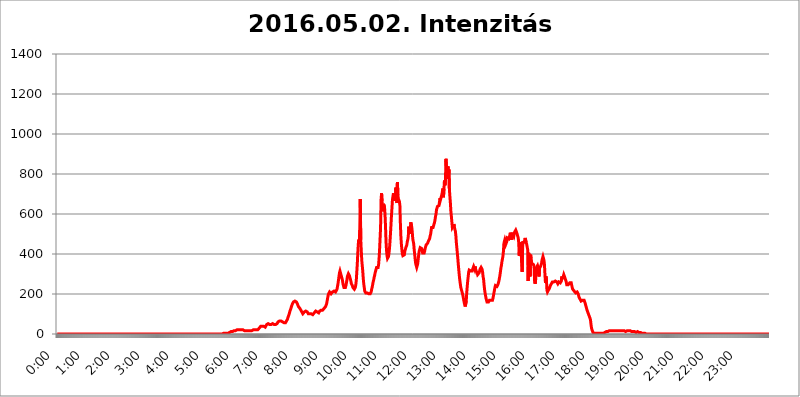
| Category | 2016.05.02. Intenzitás [W/m^2] |
|---|---|
| 0.0 | 0 |
| 0.0006944444444444445 | 0 |
| 0.001388888888888889 | 0 |
| 0.0020833333333333333 | 0 |
| 0.002777777777777778 | 0 |
| 0.003472222222222222 | 0 |
| 0.004166666666666667 | 0 |
| 0.004861111111111111 | 0 |
| 0.005555555555555556 | 0 |
| 0.0062499999999999995 | 0 |
| 0.006944444444444444 | 0 |
| 0.007638888888888889 | 0 |
| 0.008333333333333333 | 0 |
| 0.009027777777777779 | 0 |
| 0.009722222222222222 | 0 |
| 0.010416666666666666 | 0 |
| 0.011111111111111112 | 0 |
| 0.011805555555555555 | 0 |
| 0.012499999999999999 | 0 |
| 0.013194444444444444 | 0 |
| 0.013888888888888888 | 0 |
| 0.014583333333333332 | 0 |
| 0.015277777777777777 | 0 |
| 0.015972222222222224 | 0 |
| 0.016666666666666666 | 0 |
| 0.017361111111111112 | 0 |
| 0.018055555555555557 | 0 |
| 0.01875 | 0 |
| 0.019444444444444445 | 0 |
| 0.02013888888888889 | 0 |
| 0.020833333333333332 | 0 |
| 0.02152777777777778 | 0 |
| 0.022222222222222223 | 0 |
| 0.02291666666666667 | 0 |
| 0.02361111111111111 | 0 |
| 0.024305555555555556 | 0 |
| 0.024999999999999998 | 0 |
| 0.025694444444444447 | 0 |
| 0.02638888888888889 | 0 |
| 0.027083333333333334 | 0 |
| 0.027777777777777776 | 0 |
| 0.02847222222222222 | 0 |
| 0.029166666666666664 | 0 |
| 0.029861111111111113 | 0 |
| 0.030555555555555555 | 0 |
| 0.03125 | 0 |
| 0.03194444444444445 | 0 |
| 0.03263888888888889 | 0 |
| 0.03333333333333333 | 0 |
| 0.034027777777777775 | 0 |
| 0.034722222222222224 | 0 |
| 0.035416666666666666 | 0 |
| 0.036111111111111115 | 0 |
| 0.03680555555555556 | 0 |
| 0.0375 | 0 |
| 0.03819444444444444 | 0 |
| 0.03888888888888889 | 0 |
| 0.03958333333333333 | 0 |
| 0.04027777777777778 | 0 |
| 0.04097222222222222 | 0 |
| 0.041666666666666664 | 0 |
| 0.042361111111111106 | 0 |
| 0.04305555555555556 | 0 |
| 0.043750000000000004 | 0 |
| 0.044444444444444446 | 0 |
| 0.04513888888888889 | 0 |
| 0.04583333333333334 | 0 |
| 0.04652777777777778 | 0 |
| 0.04722222222222222 | 0 |
| 0.04791666666666666 | 0 |
| 0.04861111111111111 | 0 |
| 0.049305555555555554 | 0 |
| 0.049999999999999996 | 0 |
| 0.05069444444444445 | 0 |
| 0.051388888888888894 | 0 |
| 0.052083333333333336 | 0 |
| 0.05277777777777778 | 0 |
| 0.05347222222222222 | 0 |
| 0.05416666666666667 | 0 |
| 0.05486111111111111 | 0 |
| 0.05555555555555555 | 0 |
| 0.05625 | 0 |
| 0.05694444444444444 | 0 |
| 0.057638888888888885 | 0 |
| 0.05833333333333333 | 0 |
| 0.05902777777777778 | 0 |
| 0.059722222222222225 | 0 |
| 0.06041666666666667 | 0 |
| 0.061111111111111116 | 0 |
| 0.06180555555555556 | 0 |
| 0.0625 | 0 |
| 0.06319444444444444 | 0 |
| 0.06388888888888888 | 0 |
| 0.06458333333333334 | 0 |
| 0.06527777777777778 | 0 |
| 0.06597222222222222 | 0 |
| 0.06666666666666667 | 0 |
| 0.06736111111111111 | 0 |
| 0.06805555555555555 | 0 |
| 0.06874999999999999 | 0 |
| 0.06944444444444443 | 0 |
| 0.07013888888888889 | 0 |
| 0.07083333333333333 | 0 |
| 0.07152777777777779 | 0 |
| 0.07222222222222223 | 0 |
| 0.07291666666666667 | 0 |
| 0.07361111111111111 | 0 |
| 0.07430555555555556 | 0 |
| 0.075 | 0 |
| 0.07569444444444444 | 0 |
| 0.0763888888888889 | 0 |
| 0.07708333333333334 | 0 |
| 0.07777777777777778 | 0 |
| 0.07847222222222222 | 0 |
| 0.07916666666666666 | 0 |
| 0.0798611111111111 | 0 |
| 0.08055555555555556 | 0 |
| 0.08125 | 0 |
| 0.08194444444444444 | 0 |
| 0.08263888888888889 | 0 |
| 0.08333333333333333 | 0 |
| 0.08402777777777777 | 0 |
| 0.08472222222222221 | 0 |
| 0.08541666666666665 | 0 |
| 0.08611111111111112 | 0 |
| 0.08680555555555557 | 0 |
| 0.08750000000000001 | 0 |
| 0.08819444444444445 | 0 |
| 0.08888888888888889 | 0 |
| 0.08958333333333333 | 0 |
| 0.09027777777777778 | 0 |
| 0.09097222222222222 | 0 |
| 0.09166666666666667 | 0 |
| 0.09236111111111112 | 0 |
| 0.09305555555555556 | 0 |
| 0.09375 | 0 |
| 0.09444444444444444 | 0 |
| 0.09513888888888888 | 0 |
| 0.09583333333333333 | 0 |
| 0.09652777777777777 | 0 |
| 0.09722222222222222 | 0 |
| 0.09791666666666667 | 0 |
| 0.09861111111111111 | 0 |
| 0.09930555555555555 | 0 |
| 0.09999999999999999 | 0 |
| 0.10069444444444443 | 0 |
| 0.1013888888888889 | 0 |
| 0.10208333333333335 | 0 |
| 0.10277777777777779 | 0 |
| 0.10347222222222223 | 0 |
| 0.10416666666666667 | 0 |
| 0.10486111111111111 | 0 |
| 0.10555555555555556 | 0 |
| 0.10625 | 0 |
| 0.10694444444444444 | 0 |
| 0.1076388888888889 | 0 |
| 0.10833333333333334 | 0 |
| 0.10902777777777778 | 0 |
| 0.10972222222222222 | 0 |
| 0.1111111111111111 | 0 |
| 0.11180555555555556 | 0 |
| 0.11180555555555556 | 0 |
| 0.1125 | 0 |
| 0.11319444444444444 | 0 |
| 0.11388888888888889 | 0 |
| 0.11458333333333333 | 0 |
| 0.11527777777777777 | 0 |
| 0.11597222222222221 | 0 |
| 0.11666666666666665 | 0 |
| 0.1173611111111111 | 0 |
| 0.11805555555555557 | 0 |
| 0.11944444444444445 | 0 |
| 0.12013888888888889 | 0 |
| 0.12083333333333333 | 0 |
| 0.12152777777777778 | 0 |
| 0.12222222222222223 | 0 |
| 0.12291666666666667 | 0 |
| 0.12291666666666667 | 0 |
| 0.12361111111111112 | 0 |
| 0.12430555555555556 | 0 |
| 0.125 | 0 |
| 0.12569444444444444 | 0 |
| 0.12638888888888888 | 0 |
| 0.12708333333333333 | 0 |
| 0.16875 | 0 |
| 0.12847222222222224 | 0 |
| 0.12916666666666668 | 0 |
| 0.12986111111111112 | 0 |
| 0.13055555555555556 | 0 |
| 0.13125 | 0 |
| 0.13194444444444445 | 0 |
| 0.1326388888888889 | 0 |
| 0.13333333333333333 | 0 |
| 0.13402777777777777 | 0 |
| 0.13402777777777777 | 0 |
| 0.13472222222222222 | 0 |
| 0.13541666666666666 | 0 |
| 0.1361111111111111 | 0 |
| 0.13749999999999998 | 0 |
| 0.13819444444444443 | 0 |
| 0.1388888888888889 | 0 |
| 0.13958333333333334 | 0 |
| 0.14027777777777778 | 0 |
| 0.14097222222222222 | 0 |
| 0.14166666666666666 | 0 |
| 0.1423611111111111 | 0 |
| 0.14305555555555557 | 0 |
| 0.14375000000000002 | 0 |
| 0.14444444444444446 | 0 |
| 0.1451388888888889 | 0 |
| 0.1451388888888889 | 0 |
| 0.14652777777777778 | 0 |
| 0.14722222222222223 | 0 |
| 0.14791666666666667 | 0 |
| 0.1486111111111111 | 0 |
| 0.14930555555555555 | 0 |
| 0.15 | 0 |
| 0.15069444444444444 | 0 |
| 0.15138888888888888 | 0 |
| 0.15208333333333332 | 0 |
| 0.15277777777777776 | 0 |
| 0.15347222222222223 | 0 |
| 0.15416666666666667 | 0 |
| 0.15486111111111112 | 0 |
| 0.15555555555555556 | 0 |
| 0.15625 | 0 |
| 0.15694444444444444 | 0 |
| 0.15763888888888888 | 0 |
| 0.15833333333333333 | 0 |
| 0.15902777777777777 | 0 |
| 0.15972222222222224 | 0 |
| 0.16041666666666668 | 0 |
| 0.16111111111111112 | 0 |
| 0.16180555555555556 | 0 |
| 0.1625 | 0 |
| 0.16319444444444445 | 0 |
| 0.1638888888888889 | 0 |
| 0.16458333333333333 | 0 |
| 0.16527777777777777 | 0 |
| 0.16597222222222222 | 0 |
| 0.16666666666666666 | 0 |
| 0.1673611111111111 | 0 |
| 0.16805555555555554 | 0 |
| 0.16874999999999998 | 0 |
| 0.16944444444444443 | 0 |
| 0.17013888888888887 | 0 |
| 0.1708333333333333 | 0 |
| 0.17152777777777775 | 0 |
| 0.17222222222222225 | 0 |
| 0.1729166666666667 | 0 |
| 0.17361111111111113 | 0 |
| 0.17430555555555557 | 0 |
| 0.17500000000000002 | 0 |
| 0.17569444444444446 | 0 |
| 0.1763888888888889 | 0 |
| 0.17708333333333334 | 0 |
| 0.17777777777777778 | 0 |
| 0.17847222222222223 | 0 |
| 0.17916666666666667 | 0 |
| 0.1798611111111111 | 0 |
| 0.18055555555555555 | 0 |
| 0.18125 | 0 |
| 0.18194444444444444 | 0 |
| 0.1826388888888889 | 0 |
| 0.18333333333333335 | 0 |
| 0.1840277777777778 | 0 |
| 0.18472222222222223 | 0 |
| 0.18541666666666667 | 0 |
| 0.18611111111111112 | 0 |
| 0.18680555555555556 | 0 |
| 0.1875 | 0 |
| 0.18819444444444444 | 0 |
| 0.18888888888888888 | 0 |
| 0.18958333333333333 | 0 |
| 0.19027777777777777 | 0 |
| 0.1909722222222222 | 0 |
| 0.19166666666666665 | 0 |
| 0.19236111111111112 | 0 |
| 0.19305555555555554 | 0 |
| 0.19375 | 0 |
| 0.19444444444444445 | 0 |
| 0.1951388888888889 | 0 |
| 0.19583333333333333 | 0 |
| 0.19652777777777777 | 0 |
| 0.19722222222222222 | 0 |
| 0.19791666666666666 | 0 |
| 0.1986111111111111 | 0 |
| 0.19930555555555554 | 0 |
| 0.19999999999999998 | 0 |
| 0.20069444444444443 | 0 |
| 0.20138888888888887 | 0 |
| 0.2020833333333333 | 0 |
| 0.2027777777777778 | 0 |
| 0.2034722222222222 | 0 |
| 0.2041666666666667 | 0 |
| 0.20486111111111113 | 0 |
| 0.20555555555555557 | 0 |
| 0.20625000000000002 | 0 |
| 0.20694444444444446 | 0 |
| 0.2076388888888889 | 0 |
| 0.20833333333333334 | 0 |
| 0.20902777777777778 | 0 |
| 0.20972222222222223 | 0 |
| 0.21041666666666667 | 0 |
| 0.2111111111111111 | 0 |
| 0.21180555555555555 | 0 |
| 0.2125 | 0 |
| 0.21319444444444444 | 0 |
| 0.2138888888888889 | 0 |
| 0.21458333333333335 | 0 |
| 0.2152777777777778 | 0 |
| 0.21597222222222223 | 0 |
| 0.21666666666666667 | 0 |
| 0.21736111111111112 | 0 |
| 0.21805555555555556 | 0 |
| 0.21875 | 0 |
| 0.21944444444444444 | 0 |
| 0.22013888888888888 | 0 |
| 0.22083333333333333 | 0 |
| 0.22152777777777777 | 0 |
| 0.2222222222222222 | 0 |
| 0.22291666666666665 | 0 |
| 0.2236111111111111 | 0 |
| 0.22430555555555556 | 0 |
| 0.225 | 0 |
| 0.22569444444444445 | 0 |
| 0.2263888888888889 | 0 |
| 0.22708333333333333 | 0 |
| 0.22777777777777777 | 0 |
| 0.22847222222222222 | 0 |
| 0.22916666666666666 | 0 |
| 0.2298611111111111 | 0 |
| 0.23055555555555554 | 0 |
| 0.23124999999999998 | 0 |
| 0.23194444444444443 | 3.525 |
| 0.23263888888888887 | 3.525 |
| 0.2333333333333333 | 3.525 |
| 0.2340277777777778 | 3.525 |
| 0.2347222222222222 | 3.525 |
| 0.2354166666666667 | 3.525 |
| 0.23611111111111113 | 3.525 |
| 0.23680555555555557 | 3.525 |
| 0.23750000000000002 | 3.525 |
| 0.23819444444444446 | 3.525 |
| 0.2388888888888889 | 3.525 |
| 0.23958333333333334 | 3.525 |
| 0.24027777777777778 | 7.887 |
| 0.24097222222222223 | 7.887 |
| 0.24166666666666667 | 7.887 |
| 0.2423611111111111 | 7.887 |
| 0.24305555555555555 | 7.887 |
| 0.24375 | 12.257 |
| 0.24444444444444446 | 7.887 |
| 0.24513888888888888 | 12.257 |
| 0.24583333333333335 | 12.257 |
| 0.2465277777777778 | 12.257 |
| 0.24722222222222223 | 12.257 |
| 0.24791666666666667 | 16.636 |
| 0.24861111111111112 | 16.636 |
| 0.24930555555555556 | 16.636 |
| 0.25 | 16.636 |
| 0.25069444444444444 | 16.636 |
| 0.2513888888888889 | 21.024 |
| 0.2520833333333333 | 21.024 |
| 0.25277777777777777 | 21.024 |
| 0.2534722222222222 | 21.024 |
| 0.25416666666666665 | 21.024 |
| 0.2548611111111111 | 21.024 |
| 0.2555555555555556 | 21.024 |
| 0.25625000000000003 | 21.024 |
| 0.2569444444444445 | 21.024 |
| 0.2576388888888889 | 21.024 |
| 0.25833333333333336 | 21.024 |
| 0.2590277777777778 | 21.024 |
| 0.25972222222222224 | 21.024 |
| 0.2604166666666667 | 21.024 |
| 0.2611111111111111 | 21.024 |
| 0.26180555555555557 | 21.024 |
| 0.2625 | 16.636 |
| 0.26319444444444445 | 16.636 |
| 0.2638888888888889 | 16.636 |
| 0.26458333333333334 | 16.636 |
| 0.2652777777777778 | 16.636 |
| 0.2659722222222222 | 16.636 |
| 0.26666666666666666 | 16.636 |
| 0.2673611111111111 | 16.636 |
| 0.26805555555555555 | 16.636 |
| 0.26875 | 16.636 |
| 0.26944444444444443 | 16.636 |
| 0.2701388888888889 | 16.636 |
| 0.2708333333333333 | 16.636 |
| 0.27152777777777776 | 16.636 |
| 0.2722222222222222 | 16.636 |
| 0.27291666666666664 | 16.636 |
| 0.2736111111111111 | 16.636 |
| 0.2743055555555555 | 16.636 |
| 0.27499999999999997 | 21.024 |
| 0.27569444444444446 | 21.024 |
| 0.27638888888888885 | 21.024 |
| 0.27708333333333335 | 21.024 |
| 0.2777777777777778 | 21.024 |
| 0.27847222222222223 | 21.024 |
| 0.2791666666666667 | 21.024 |
| 0.2798611111111111 | 21.024 |
| 0.28055555555555556 | 21.024 |
| 0.28125 | 21.024 |
| 0.28194444444444444 | 25.419 |
| 0.2826388888888889 | 25.419 |
| 0.2833333333333333 | 29.823 |
| 0.28402777777777777 | 29.823 |
| 0.2847222222222222 | 34.234 |
| 0.28541666666666665 | 38.653 |
| 0.28611111111111115 | 38.653 |
| 0.28680555555555554 | 38.653 |
| 0.28750000000000003 | 38.653 |
| 0.2881944444444445 | 38.653 |
| 0.2888888888888889 | 38.653 |
| 0.28958333333333336 | 38.653 |
| 0.2902777777777778 | 34.234 |
| 0.29097222222222224 | 34.234 |
| 0.2916666666666667 | 34.234 |
| 0.2923611111111111 | 38.653 |
| 0.29305555555555557 | 38.653 |
| 0.29375 | 47.511 |
| 0.29444444444444445 | 47.511 |
| 0.2951388888888889 | 51.951 |
| 0.29583333333333334 | 51.951 |
| 0.2965277777777778 | 47.511 |
| 0.2972222222222222 | 47.511 |
| 0.29791666666666666 | 47.511 |
| 0.2986111111111111 | 47.511 |
| 0.29930555555555555 | 47.511 |
| 0.3 | 47.511 |
| 0.30069444444444443 | 51.951 |
| 0.3013888888888889 | 51.951 |
| 0.3020833333333333 | 51.951 |
| 0.30277777777777776 | 51.951 |
| 0.3034722222222222 | 47.511 |
| 0.30416666666666664 | 47.511 |
| 0.3048611111111111 | 47.511 |
| 0.3055555555555555 | 47.511 |
| 0.30624999999999997 | 47.511 |
| 0.3069444444444444 | 47.511 |
| 0.3076388888888889 | 47.511 |
| 0.30833333333333335 | 51.951 |
| 0.3090277777777778 | 56.398 |
| 0.30972222222222223 | 60.85 |
| 0.3104166666666667 | 60.85 |
| 0.3111111111111111 | 65.31 |
| 0.31180555555555556 | 65.31 |
| 0.3125 | 65.31 |
| 0.31319444444444444 | 65.31 |
| 0.3138888888888889 | 65.31 |
| 0.3145833333333333 | 65.31 |
| 0.31527777777777777 | 65.31 |
| 0.3159722222222222 | 60.85 |
| 0.31666666666666665 | 60.85 |
| 0.31736111111111115 | 60.85 |
| 0.31805555555555554 | 56.398 |
| 0.31875000000000003 | 56.398 |
| 0.3194444444444445 | 56.398 |
| 0.3201388888888889 | 56.398 |
| 0.32083333333333336 | 60.85 |
| 0.3215277777777778 | 65.31 |
| 0.32222222222222224 | 69.775 |
| 0.3229166666666667 | 74.246 |
| 0.3236111111111111 | 83.205 |
| 0.32430555555555557 | 87.692 |
| 0.325 | 96.682 |
| 0.32569444444444445 | 105.69 |
| 0.3263888888888889 | 114.716 |
| 0.32708333333333334 | 119.235 |
| 0.3277777777777778 | 128.284 |
| 0.3284722222222222 | 137.347 |
| 0.32916666666666666 | 141.884 |
| 0.3298611111111111 | 150.964 |
| 0.33055555555555555 | 155.509 |
| 0.33125 | 160.056 |
| 0.33194444444444443 | 164.605 |
| 0.3326388888888889 | 164.605 |
| 0.3333333333333333 | 164.605 |
| 0.3340277777777778 | 169.156 |
| 0.3347222222222222 | 164.605 |
| 0.3354166666666667 | 160.056 |
| 0.3361111111111111 | 155.509 |
| 0.3368055555555556 | 150.964 |
| 0.33749999999999997 | 146.423 |
| 0.33819444444444446 | 137.347 |
| 0.33888888888888885 | 137.347 |
| 0.33958333333333335 | 132.814 |
| 0.34027777777777773 | 128.284 |
| 0.34097222222222223 | 123.758 |
| 0.3416666666666666 | 119.235 |
| 0.3423611111111111 | 114.716 |
| 0.3430555555555555 | 110.201 |
| 0.34375 | 105.69 |
| 0.3444444444444445 | 101.184 |
| 0.3451388888888889 | 105.69 |
| 0.3458333333333334 | 105.69 |
| 0.34652777777777777 | 110.201 |
| 0.34722222222222227 | 110.201 |
| 0.34791666666666665 | 114.716 |
| 0.34861111111111115 | 114.716 |
| 0.34930555555555554 | 119.235 |
| 0.35000000000000003 | 114.716 |
| 0.3506944444444444 | 110.201 |
| 0.3513888888888889 | 105.69 |
| 0.3520833333333333 | 101.184 |
| 0.3527777777777778 | 101.184 |
| 0.3534722222222222 | 101.184 |
| 0.3541666666666667 | 101.184 |
| 0.3548611111111111 | 101.184 |
| 0.35555555555555557 | 101.184 |
| 0.35625 | 101.184 |
| 0.35694444444444445 | 101.184 |
| 0.3576388888888889 | 96.682 |
| 0.35833333333333334 | 96.682 |
| 0.3590277777777778 | 101.184 |
| 0.3597222222222222 | 101.184 |
| 0.36041666666666666 | 105.69 |
| 0.3611111111111111 | 110.201 |
| 0.36180555555555555 | 110.201 |
| 0.3625 | 114.716 |
| 0.36319444444444443 | 114.716 |
| 0.3638888888888889 | 110.201 |
| 0.3645833333333333 | 110.201 |
| 0.3652777777777778 | 105.69 |
| 0.3659722222222222 | 105.69 |
| 0.3666666666666667 | 105.69 |
| 0.3673611111111111 | 110.201 |
| 0.3680555555555556 | 114.716 |
| 0.36874999999999997 | 114.716 |
| 0.36944444444444446 | 119.235 |
| 0.37013888888888885 | 119.235 |
| 0.37083333333333335 | 119.235 |
| 0.37152777777777773 | 119.235 |
| 0.37222222222222223 | 119.235 |
| 0.3729166666666666 | 123.758 |
| 0.3736111111111111 | 123.758 |
| 0.3743055555555555 | 128.284 |
| 0.375 | 128.284 |
| 0.3756944444444445 | 132.814 |
| 0.3763888888888889 | 137.347 |
| 0.3770833333333334 | 141.884 |
| 0.37777777777777777 | 150.964 |
| 0.37847222222222227 | 164.605 |
| 0.37916666666666665 | 178.264 |
| 0.37986111111111115 | 191.937 |
| 0.38055555555555554 | 201.058 |
| 0.38125000000000003 | 205.62 |
| 0.3819444444444444 | 210.182 |
| 0.3826388888888889 | 210.182 |
| 0.3833333333333333 | 205.62 |
| 0.3840277777777778 | 201.058 |
| 0.3847222222222222 | 205.62 |
| 0.3854166666666667 | 205.62 |
| 0.3861111111111111 | 210.182 |
| 0.38680555555555557 | 210.182 |
| 0.3875 | 214.746 |
| 0.38819444444444445 | 214.746 |
| 0.3888888888888889 | 210.182 |
| 0.38958333333333334 | 210.182 |
| 0.3902777777777778 | 210.182 |
| 0.3909722222222222 | 210.182 |
| 0.39166666666666666 | 214.746 |
| 0.3923611111111111 | 223.873 |
| 0.39305555555555555 | 237.564 |
| 0.39375 | 251.251 |
| 0.39444444444444443 | 269.49 |
| 0.3951388888888889 | 287.709 |
| 0.3958333333333333 | 305.898 |
| 0.3965277777777778 | 314.98 |
| 0.3972222222222222 | 310.44 |
| 0.3979166666666667 | 296.808 |
| 0.3986111111111111 | 287.709 |
| 0.3993055555555556 | 278.603 |
| 0.39999999999999997 | 269.49 |
| 0.40069444444444446 | 251.251 |
| 0.40138888888888885 | 242.127 |
| 0.40208333333333335 | 233 |
| 0.40277777777777773 | 228.436 |
| 0.40347222222222223 | 228.436 |
| 0.4041666666666666 | 233 |
| 0.4048611111111111 | 242.127 |
| 0.4055555555555555 | 255.813 |
| 0.40625 | 269.49 |
| 0.4069444444444445 | 287.709 |
| 0.4076388888888889 | 292.259 |
| 0.4083333333333334 | 301.354 |
| 0.40902777777777777 | 301.354 |
| 0.40972222222222227 | 292.259 |
| 0.41041666666666665 | 283.156 |
| 0.41111111111111115 | 274.047 |
| 0.41180555555555554 | 264.932 |
| 0.41250000000000003 | 251.251 |
| 0.4131944444444444 | 246.689 |
| 0.4138888888888889 | 242.127 |
| 0.4145833333333333 | 233 |
| 0.4152777777777778 | 233 |
| 0.4159722222222222 | 228.436 |
| 0.4166666666666667 | 223.873 |
| 0.4173611111111111 | 228.436 |
| 0.41805555555555557 | 233 |
| 0.41875 | 246.689 |
| 0.41944444444444445 | 269.49 |
| 0.4201388888888889 | 310.44 |
| 0.42083333333333334 | 351.198 |
| 0.4215277777777778 | 405.108 |
| 0.4222222222222222 | 449.551 |
| 0.42291666666666666 | 471.582 |
| 0.4236111111111111 | 449.551 |
| 0.42430555555555555 | 519.555 |
| 0.425 | 675.311 |
| 0.42569444444444443 | 471.582 |
| 0.4263888888888889 | 418.492 |
| 0.4270833333333333 | 369.23 |
| 0.4277777777777778 | 342.162 |
| 0.4284722222222222 | 314.98 |
| 0.4291666666666667 | 278.603 |
| 0.4298611111111111 | 251.251 |
| 0.4305555555555556 | 233 |
| 0.43124999999999997 | 214.746 |
| 0.43194444444444446 | 210.182 |
| 0.43263888888888885 | 205.62 |
| 0.43333333333333335 | 205.62 |
| 0.43402777777777773 | 205.62 |
| 0.43472222222222223 | 205.62 |
| 0.4354166666666666 | 201.058 |
| 0.4361111111111111 | 201.058 |
| 0.4368055555555555 | 201.058 |
| 0.4375 | 205.62 |
| 0.4381944444444445 | 205.62 |
| 0.4388888888888889 | 201.058 |
| 0.4395833333333334 | 205.62 |
| 0.44027777777777777 | 210.182 |
| 0.44097222222222227 | 223.873 |
| 0.44166666666666665 | 233 |
| 0.44236111111111115 | 246.689 |
| 0.44305555555555554 | 260.373 |
| 0.44375000000000003 | 269.49 |
| 0.4444444444444444 | 283.156 |
| 0.4451388888888889 | 292.259 |
| 0.4458333333333333 | 305.898 |
| 0.4465277777777778 | 314.98 |
| 0.4472222222222222 | 324.052 |
| 0.4479166666666667 | 333.113 |
| 0.4486111111111111 | 333.113 |
| 0.44930555555555557 | 328.584 |
| 0.45 | 333.113 |
| 0.45069444444444445 | 346.682 |
| 0.4513888888888889 | 378.224 |
| 0.45208333333333334 | 422.943 |
| 0.4527777777777778 | 475.972 |
| 0.4534722222222222 | 532.513 |
| 0.45416666666666666 | 671.22 |
| 0.4548611111111111 | 703.762 |
| 0.45555555555555555 | 663.019 |
| 0.45625 | 629.948 |
| 0.45694444444444443 | 613.252 |
| 0.4576388888888889 | 650.667 |
| 0.4583333333333333 | 654.791 |
| 0.4590277777777778 | 634.105 |
| 0.4597222222222222 | 596.45 |
| 0.4604166666666667 | 536.82 |
| 0.4611111111111111 | 462.786 |
| 0.4618055555555556 | 418.492 |
| 0.46249999999999997 | 391.685 |
| 0.46319444444444446 | 378.224 |
| 0.46388888888888885 | 378.224 |
| 0.46458333333333335 | 387.202 |
| 0.46527777777777773 | 405.108 |
| 0.46597222222222223 | 427.39 |
| 0.4666666666666666 | 462.786 |
| 0.4673611111111111 | 502.192 |
| 0.4680555555555555 | 545.416 |
| 0.46875 | 592.233 |
| 0.4694444444444445 | 629.948 |
| 0.4701388888888889 | 671.22 |
| 0.4708333333333334 | 687.544 |
| 0.47152777777777777 | 703.762 |
| 0.47222222222222227 | 667.123 |
| 0.47291666666666665 | 687.544 |
| 0.47361111111111115 | 691.608 |
| 0.47430555555555554 | 667.123 |
| 0.47500000000000003 | 731.896 |
| 0.4756944444444444 | 683.473 |
| 0.4763888888888889 | 654.791 |
| 0.4770833333333333 | 759.723 |
| 0.4777777777777778 | 695.666 |
| 0.4784722222222222 | 675.311 |
| 0.4791666666666667 | 675.311 |
| 0.4798611111111111 | 663.019 |
| 0.48055555555555557 | 642.4 |
| 0.48125 | 553.986 |
| 0.48194444444444445 | 489.108 |
| 0.4826388888888889 | 449.551 |
| 0.48333333333333334 | 422.943 |
| 0.4840277777777778 | 400.638 |
| 0.4847222222222222 | 391.685 |
| 0.48541666666666666 | 387.202 |
| 0.4861111111111111 | 391.685 |
| 0.48680555555555555 | 396.164 |
| 0.4875 | 414.035 |
| 0.48819444444444443 | 422.943 |
| 0.4888888888888889 | 431.833 |
| 0.4895833333333333 | 431.833 |
| 0.4902777777777778 | 445.129 |
| 0.4909722222222222 | 462.786 |
| 0.4916666666666667 | 471.582 |
| 0.4923611111111111 | 489.108 |
| 0.4930555555555556 | 536.82 |
| 0.49374999999999997 | 515.223 |
| 0.49444444444444446 | 502.192 |
| 0.49513888888888885 | 515.223 |
| 0.49583333333333335 | 558.261 |
| 0.49652777777777773 | 558.261 |
| 0.49722222222222223 | 532.513 |
| 0.4979166666666666 | 510.885 |
| 0.4986111111111111 | 475.972 |
| 0.4993055555555555 | 471.582 |
| 0.5 | 449.551 |
| 0.5006944444444444 | 418.492 |
| 0.5013888888888889 | 396.164 |
| 0.5020833333333333 | 369.23 |
| 0.5027777777777778 | 351.198 |
| 0.5034722222222222 | 342.162 |
| 0.5041666666666667 | 333.113 |
| 0.5048611111111111 | 337.639 |
| 0.5055555555555555 | 351.198 |
| 0.50625 | 373.729 |
| 0.5069444444444444 | 396.164 |
| 0.5076388888888889 | 414.035 |
| 0.5083333333333333 | 422.943 |
| 0.5090277777777777 | 431.833 |
| 0.5097222222222222 | 436.27 |
| 0.5104166666666666 | 436.27 |
| 0.5111111111111112 | 427.39 |
| 0.5118055555555555 | 418.492 |
| 0.5125000000000001 | 405.108 |
| 0.5131944444444444 | 400.638 |
| 0.513888888888889 | 400.638 |
| 0.5145833333333333 | 405.108 |
| 0.5152777777777778 | 414.035 |
| 0.5159722222222222 | 427.39 |
| 0.5166666666666667 | 436.27 |
| 0.517361111111111 | 445.129 |
| 0.5180555555555556 | 449.551 |
| 0.5187499999999999 | 449.551 |
| 0.5194444444444445 | 453.968 |
| 0.5201388888888888 | 458.38 |
| 0.5208333333333334 | 467.187 |
| 0.5215277777777778 | 471.582 |
| 0.5222222222222223 | 475.972 |
| 0.5229166666666667 | 489.108 |
| 0.5236111111111111 | 497.836 |
| 0.5243055555555556 | 515.223 |
| 0.525 | 532.513 |
| 0.5256944444444445 | 528.2 |
| 0.5263888888888889 | 528.2 |
| 0.5270833333333333 | 532.513 |
| 0.5277777777777778 | 541.121 |
| 0.5284722222222222 | 549.704 |
| 0.5291666666666667 | 558.261 |
| 0.5298611111111111 | 571.049 |
| 0.5305555555555556 | 588.009 |
| 0.53125 | 600.661 |
| 0.5319444444444444 | 621.613 |
| 0.5326388888888889 | 629.948 |
| 0.5333333333333333 | 638.256 |
| 0.5340277777777778 | 642.4 |
| 0.5347222222222222 | 642.4 |
| 0.5354166666666667 | 642.4 |
| 0.5361111111111111 | 646.537 |
| 0.5368055555555555 | 679.395 |
| 0.5375 | 671.22 |
| 0.5381944444444444 | 671.22 |
| 0.5388888888888889 | 671.22 |
| 0.5395833333333333 | 699.717 |
| 0.5402777777777777 | 695.666 |
| 0.5409722222222222 | 727.896 |
| 0.5416666666666666 | 683.473 |
| 0.5423611111111112 | 723.889 |
| 0.5430555555555555 | 767.62 |
| 0.5437500000000001 | 743.859 |
| 0.5444444444444444 | 763.674 |
| 0.545138888888889 | 875.918 |
| 0.5458333333333333 | 837.682 |
| 0.5465277777777778 | 798.974 |
| 0.5472222222222222 | 775.492 |
| 0.5479166666666667 | 837.682 |
| 0.548611111111111 | 787.258 |
| 0.5493055555555556 | 822.26 |
| 0.5499999999999999 | 723.889 |
| 0.5506944444444445 | 687.544 |
| 0.5513888888888888 | 654.791 |
| 0.5520833333333334 | 613.252 |
| 0.5527777777777778 | 588.009 |
| 0.5534722222222223 | 583.779 |
| 0.5541666666666667 | 532.513 |
| 0.5548611111111111 | 528.2 |
| 0.5555555555555556 | 541.121 |
| 0.55625 | 549.704 |
| 0.5569444444444445 | 536.82 |
| 0.5576388888888889 | 523.88 |
| 0.5583333333333333 | 515.223 |
| 0.5590277777777778 | 493.475 |
| 0.5597222222222222 | 458.38 |
| 0.5604166666666667 | 431.833 |
| 0.5611111111111111 | 405.108 |
| 0.5618055555555556 | 378.224 |
| 0.5625 | 346.682 |
| 0.5631944444444444 | 319.517 |
| 0.5638888888888889 | 292.259 |
| 0.5645833333333333 | 269.49 |
| 0.5652777777777778 | 251.251 |
| 0.5659722222222222 | 233 |
| 0.5666666666666667 | 223.873 |
| 0.5673611111111111 | 214.746 |
| 0.5680555555555555 | 205.62 |
| 0.56875 | 196.497 |
| 0.5694444444444444 | 182.82 |
| 0.5701388888888889 | 169.156 |
| 0.5708333333333333 | 155.509 |
| 0.5715277777777777 | 146.423 |
| 0.5722222222222222 | 137.347 |
| 0.5729166666666666 | 141.884 |
| 0.5736111111111112 | 164.605 |
| 0.5743055555555555 | 205.62 |
| 0.5750000000000001 | 237.564 |
| 0.5756944444444444 | 264.932 |
| 0.576388888888889 | 287.709 |
| 0.5770833333333333 | 310.44 |
| 0.5777777777777778 | 319.517 |
| 0.5784722222222222 | 319.517 |
| 0.5791666666666667 | 324.052 |
| 0.579861111111111 | 314.98 |
| 0.5805555555555556 | 310.44 |
| 0.5812499999999999 | 310.44 |
| 0.5819444444444445 | 314.98 |
| 0.5826388888888888 | 324.052 |
| 0.5833333333333334 | 328.584 |
| 0.5840277777777778 | 337.639 |
| 0.5847222222222223 | 333.113 |
| 0.5854166666666667 | 324.052 |
| 0.5861111111111111 | 337.639 |
| 0.5868055555555556 | 324.052 |
| 0.5875 | 314.98 |
| 0.5881944444444445 | 314.98 |
| 0.5888888888888889 | 305.898 |
| 0.5895833333333333 | 296.808 |
| 0.5902777777777778 | 292.259 |
| 0.5909722222222222 | 296.808 |
| 0.5916666666666667 | 305.898 |
| 0.5923611111111111 | 314.98 |
| 0.5930555555555556 | 324.052 |
| 0.59375 | 328.584 |
| 0.5944444444444444 | 333.113 |
| 0.5951388888888889 | 333.113 |
| 0.5958333333333333 | 324.052 |
| 0.5965277777777778 | 310.44 |
| 0.5972222222222222 | 287.709 |
| 0.5979166666666667 | 274.047 |
| 0.5986111111111111 | 246.689 |
| 0.5993055555555555 | 223.873 |
| 0.6 | 205.62 |
| 0.6006944444444444 | 191.937 |
| 0.6013888888888889 | 178.264 |
| 0.6020833333333333 | 169.156 |
| 0.6027777777777777 | 160.056 |
| 0.6034722222222222 | 155.509 |
| 0.6041666666666666 | 155.509 |
| 0.6048611111111112 | 160.056 |
| 0.6055555555555555 | 164.605 |
| 0.6062500000000001 | 169.156 |
| 0.6069444444444444 | 169.156 |
| 0.607638888888889 | 173.709 |
| 0.6083333333333333 | 169.156 |
| 0.6090277777777778 | 169.156 |
| 0.6097222222222222 | 164.605 |
| 0.6104166666666667 | 169.156 |
| 0.611111111111111 | 178.264 |
| 0.6118055555555556 | 191.937 |
| 0.6124999999999999 | 205.62 |
| 0.6131944444444445 | 219.309 |
| 0.6138888888888888 | 233 |
| 0.6145833333333334 | 242.127 |
| 0.6152777777777778 | 237.564 |
| 0.6159722222222223 | 237.564 |
| 0.6166666666666667 | 237.564 |
| 0.6173611111111111 | 237.564 |
| 0.6180555555555556 | 246.689 |
| 0.61875 | 251.251 |
| 0.6194444444444445 | 264.932 |
| 0.6201388888888889 | 278.603 |
| 0.6208333333333333 | 292.259 |
| 0.6215277777777778 | 310.44 |
| 0.6222222222222222 | 328.584 |
| 0.6229166666666667 | 342.162 |
| 0.6236111111111111 | 360.221 |
| 0.6243055555555556 | 373.729 |
| 0.625 | 387.202 |
| 0.6256944444444444 | 409.574 |
| 0.6263888888888889 | 449.551 |
| 0.6270833333333333 | 462.786 |
| 0.6277777777777778 | 471.582 |
| 0.6284722222222222 | 462.786 |
| 0.6291666666666667 | 449.551 |
| 0.6298611111111111 | 453.968 |
| 0.6305555555555555 | 462.786 |
| 0.63125 | 480.356 |
| 0.6319444444444444 | 480.356 |
| 0.6326388888888889 | 480.356 |
| 0.6333333333333333 | 475.972 |
| 0.6340277777777777 | 484.735 |
| 0.6347222222222222 | 493.475 |
| 0.6354166666666666 | 506.542 |
| 0.6361111111111112 | 506.542 |
| 0.6368055555555555 | 510.885 |
| 0.6375000000000001 | 471.582 |
| 0.6381944444444444 | 506.542 |
| 0.638888888888889 | 497.836 |
| 0.6395833333333333 | 502.192 |
| 0.6402777777777778 | 489.108 |
| 0.6409722222222222 | 506.542 |
| 0.6416666666666667 | 506.542 |
| 0.642361111111111 | 510.885 |
| 0.6430555555555556 | 519.555 |
| 0.6437499999999999 | 515.223 |
| 0.6444444444444445 | 506.542 |
| 0.6451388888888888 | 510.885 |
| 0.6458333333333334 | 502.192 |
| 0.6465277777777778 | 480.356 |
| 0.6472222222222223 | 458.38 |
| 0.6479166666666667 | 391.685 |
| 0.6486111111111111 | 436.27 |
| 0.6493055555555556 | 440.702 |
| 0.65 | 458.38 |
| 0.6506944444444445 | 462.786 |
| 0.6513888888888889 | 355.712 |
| 0.6520833333333333 | 310.44 |
| 0.6527777777777778 | 462.786 |
| 0.6534722222222222 | 453.968 |
| 0.6541666666666667 | 458.38 |
| 0.6548611111111111 | 453.968 |
| 0.6555555555555556 | 467.187 |
| 0.65625 | 480.356 |
| 0.6569444444444444 | 475.972 |
| 0.6576388888888889 | 458.38 |
| 0.6583333333333333 | 449.551 |
| 0.6590277777777778 | 453.968 |
| 0.6597222222222222 | 422.943 |
| 0.6604166666666667 | 264.932 |
| 0.6611111111111111 | 405.108 |
| 0.6618055555555555 | 405.108 |
| 0.6625 | 391.685 |
| 0.6631944444444444 | 287.709 |
| 0.6638888888888889 | 396.164 |
| 0.6645833333333333 | 378.224 |
| 0.6652777777777777 | 360.221 |
| 0.6659722222222222 | 351.198 |
| 0.6666666666666666 | 346.682 |
| 0.6673611111111111 | 346.682 |
| 0.6680555555555556 | 346.682 |
| 0.6687500000000001 | 337.639 |
| 0.6694444444444444 | 264.932 |
| 0.6701388888888888 | 251.251 |
| 0.6708333333333334 | 260.373 |
| 0.6715277777777778 | 324.052 |
| 0.6722222222222222 | 333.113 |
| 0.6729166666666666 | 337.639 |
| 0.6736111111111112 | 342.162 |
| 0.6743055555555556 | 333.113 |
| 0.6749999999999999 | 324.052 |
| 0.6756944444444444 | 287.709 |
| 0.6763888888888889 | 328.584 |
| 0.6770833333333334 | 333.113 |
| 0.6777777777777777 | 337.639 |
| 0.6784722222222223 | 337.639 |
| 0.6791666666666667 | 351.198 |
| 0.6798611111111111 | 369.23 |
| 0.6805555555555555 | 378.224 |
| 0.68125 | 387.202 |
| 0.6819444444444445 | 382.715 |
| 0.6826388888888889 | 369.23 |
| 0.6833333333333332 | 346.682 |
| 0.6840277777777778 | 296.808 |
| 0.6847222222222222 | 255.813 |
| 0.6854166666666667 | 287.709 |
| 0.686111111111111 | 269.49 |
| 0.6868055555555556 | 219.309 |
| 0.6875 | 210.182 |
| 0.6881944444444444 | 210.182 |
| 0.688888888888889 | 219.309 |
| 0.6895833333333333 | 223.873 |
| 0.6902777777777778 | 228.436 |
| 0.6909722222222222 | 233 |
| 0.6916666666666668 | 242.127 |
| 0.6923611111111111 | 246.689 |
| 0.6930555555555555 | 251.251 |
| 0.69375 | 255.813 |
| 0.6944444444444445 | 260.373 |
| 0.6951388888888889 | 255.813 |
| 0.6958333333333333 | 260.373 |
| 0.6965277777777777 | 260.373 |
| 0.6972222222222223 | 260.373 |
| 0.6979166666666666 | 264.932 |
| 0.6986111111111111 | 264.932 |
| 0.6993055555555556 | 264.932 |
| 0.7000000000000001 | 264.932 |
| 0.7006944444444444 | 260.373 |
| 0.7013888888888888 | 255.813 |
| 0.7020833333333334 | 251.251 |
| 0.7027777777777778 | 251.251 |
| 0.7034722222222222 | 260.373 |
| 0.7041666666666666 | 260.373 |
| 0.7048611111111112 | 260.373 |
| 0.7055555555555556 | 255.813 |
| 0.7062499999999999 | 260.373 |
| 0.7069444444444444 | 264.932 |
| 0.7076388888888889 | 287.709 |
| 0.7083333333333334 | 278.603 |
| 0.7090277777777777 | 278.603 |
| 0.7097222222222223 | 287.709 |
| 0.7104166666666667 | 296.808 |
| 0.7111111111111111 | 292.259 |
| 0.7118055555555555 | 283.156 |
| 0.7125 | 278.603 |
| 0.7131944444444445 | 278.603 |
| 0.7138888888888889 | 260.373 |
| 0.7145833333333332 | 246.689 |
| 0.7152777777777778 | 246.689 |
| 0.7159722222222222 | 246.689 |
| 0.7166666666666667 | 246.689 |
| 0.717361111111111 | 246.689 |
| 0.7180555555555556 | 251.251 |
| 0.71875 | 255.813 |
| 0.7194444444444444 | 260.373 |
| 0.720138888888889 | 260.373 |
| 0.7208333333333333 | 255.813 |
| 0.7215277777777778 | 251.251 |
| 0.7222222222222222 | 233 |
| 0.7229166666666668 | 223.873 |
| 0.7236111111111111 | 223.873 |
| 0.7243055555555555 | 219.309 |
| 0.725 | 214.746 |
| 0.7256944444444445 | 210.182 |
| 0.7263888888888889 | 210.182 |
| 0.7270833333333333 | 205.62 |
| 0.7277777777777777 | 205.62 |
| 0.7284722222222223 | 210.182 |
| 0.7291666666666666 | 210.182 |
| 0.7298611111111111 | 205.62 |
| 0.7305555555555556 | 201.058 |
| 0.7312500000000001 | 191.937 |
| 0.7319444444444444 | 182.82 |
| 0.7326388888888888 | 178.264 |
| 0.7333333333333334 | 173.709 |
| 0.7340277777777778 | 169.156 |
| 0.7347222222222222 | 164.605 |
| 0.7354166666666666 | 164.605 |
| 0.7361111111111112 | 164.605 |
| 0.7368055555555556 | 169.156 |
| 0.7374999999999999 | 173.709 |
| 0.7381944444444444 | 173.709 |
| 0.7388888888888889 | 169.156 |
| 0.7395833333333334 | 164.605 |
| 0.7402777777777777 | 155.509 |
| 0.7409722222222223 | 146.423 |
| 0.7416666666666667 | 137.347 |
| 0.7423611111111111 | 128.284 |
| 0.7430555555555555 | 119.235 |
| 0.74375 | 114.716 |
| 0.7444444444444445 | 105.69 |
| 0.7451388888888889 | 101.184 |
| 0.7458333333333332 | 92.184 |
| 0.7465277777777778 | 87.692 |
| 0.7472222222222222 | 78.722 |
| 0.7479166666666667 | 69.775 |
| 0.748611111111111 | 47.511 |
| 0.7493055555555556 | 29.823 |
| 0.75 | 21.024 |
| 0.7506944444444444 | 16.636 |
| 0.751388888888889 | 7.887 |
| 0.7520833333333333 | 3.525 |
| 0.7527777777777778 | 3.525 |
| 0.7534722222222222 | 3.525 |
| 0.7541666666666668 | 3.525 |
| 0.7548611111111111 | 3.525 |
| 0.7555555555555555 | 3.525 |
| 0.75625 | 3.525 |
| 0.7569444444444445 | 3.525 |
| 0.7576388888888889 | 3.525 |
| 0.7583333333333333 | 3.525 |
| 0.7590277777777777 | 3.525 |
| 0.7597222222222223 | 3.525 |
| 0.7604166666666666 | 3.525 |
| 0.7611111111111111 | 3.525 |
| 0.7618055555555556 | 3.525 |
| 0.7625000000000001 | 3.525 |
| 0.7631944444444444 | 3.525 |
| 0.7638888888888888 | 3.525 |
| 0.7645833333333334 | 3.525 |
| 0.7652777777777778 | 3.525 |
| 0.7659722222222222 | 3.525 |
| 0.7666666666666666 | 3.525 |
| 0.7673611111111112 | 7.887 |
| 0.7680555555555556 | 7.887 |
| 0.7687499999999999 | 7.887 |
| 0.7694444444444444 | 7.887 |
| 0.7701388888888889 | 12.257 |
| 0.7708333333333334 | 12.257 |
| 0.7715277777777777 | 12.257 |
| 0.7722222222222223 | 12.257 |
| 0.7729166666666667 | 16.636 |
| 0.7736111111111111 | 16.636 |
| 0.7743055555555555 | 16.636 |
| 0.775 | 16.636 |
| 0.7756944444444445 | 16.636 |
| 0.7763888888888889 | 16.636 |
| 0.7770833333333332 | 16.636 |
| 0.7777777777777778 | 16.636 |
| 0.7784722222222222 | 16.636 |
| 0.7791666666666667 | 16.636 |
| 0.779861111111111 | 16.636 |
| 0.7805555555555556 | 16.636 |
| 0.78125 | 16.636 |
| 0.7819444444444444 | 16.636 |
| 0.782638888888889 | 16.636 |
| 0.7833333333333333 | 16.636 |
| 0.7840277777777778 | 16.636 |
| 0.7847222222222222 | 16.636 |
| 0.7854166666666668 | 16.636 |
| 0.7861111111111111 | 16.636 |
| 0.7868055555555555 | 16.636 |
| 0.7875 | 16.636 |
| 0.7881944444444445 | 16.636 |
| 0.7888888888888889 | 16.636 |
| 0.7895833333333333 | 16.636 |
| 0.7902777777777777 | 16.636 |
| 0.7909722222222223 | 16.636 |
| 0.7916666666666666 | 16.636 |
| 0.7923611111111111 | 16.636 |
| 0.7930555555555556 | 16.636 |
| 0.7937500000000001 | 16.636 |
| 0.7944444444444444 | 16.636 |
| 0.7951388888888888 | 16.636 |
| 0.7958333333333334 | 16.636 |
| 0.7965277777777778 | 12.257 |
| 0.7972222222222222 | 12.257 |
| 0.7979166666666666 | 12.257 |
| 0.7986111111111112 | 16.636 |
| 0.7993055555555556 | 16.636 |
| 0.7999999999999999 | 16.636 |
| 0.8006944444444444 | 16.636 |
| 0.8013888888888889 | 16.636 |
| 0.8020833333333334 | 16.636 |
| 0.8027777777777777 | 16.636 |
| 0.8034722222222223 | 16.636 |
| 0.8041666666666667 | 12.257 |
| 0.8048611111111111 | 12.257 |
| 0.8055555555555555 | 12.257 |
| 0.80625 | 12.257 |
| 0.8069444444444445 | 12.257 |
| 0.8076388888888889 | 12.257 |
| 0.8083333333333332 | 12.257 |
| 0.8090277777777778 | 12.257 |
| 0.8097222222222222 | 12.257 |
| 0.8104166666666667 | 12.257 |
| 0.811111111111111 | 12.257 |
| 0.8118055555555556 | 7.887 |
| 0.8125 | 7.887 |
| 0.8131944444444444 | 7.887 |
| 0.813888888888889 | 12.257 |
| 0.8145833333333333 | 7.887 |
| 0.8152777777777778 | 7.887 |
| 0.8159722222222222 | 7.887 |
| 0.8166666666666668 | 7.887 |
| 0.8173611111111111 | 7.887 |
| 0.8180555555555555 | 7.887 |
| 0.81875 | 7.887 |
| 0.8194444444444445 | 3.525 |
| 0.8201388888888889 | 3.525 |
| 0.8208333333333333 | 3.525 |
| 0.8215277777777777 | 3.525 |
| 0.8222222222222223 | 3.525 |
| 0.8229166666666666 | 3.525 |
| 0.8236111111111111 | 3.525 |
| 0.8243055555555556 | 3.525 |
| 0.8250000000000001 | 3.525 |
| 0.8256944444444444 | 0 |
| 0.8263888888888888 | 0 |
| 0.8270833333333334 | 0 |
| 0.8277777777777778 | 0 |
| 0.8284722222222222 | 0 |
| 0.8291666666666666 | 0 |
| 0.8298611111111112 | 0 |
| 0.8305555555555556 | 0 |
| 0.8312499999999999 | 0 |
| 0.8319444444444444 | 0 |
| 0.8326388888888889 | 0 |
| 0.8333333333333334 | 0 |
| 0.8340277777777777 | 0 |
| 0.8347222222222223 | 0 |
| 0.8354166666666667 | 0 |
| 0.8361111111111111 | 0 |
| 0.8368055555555555 | 0 |
| 0.8375 | 0 |
| 0.8381944444444445 | 0 |
| 0.8388888888888889 | 0 |
| 0.8395833333333332 | 0 |
| 0.8402777777777778 | 0 |
| 0.8409722222222222 | 0 |
| 0.8416666666666667 | 0 |
| 0.842361111111111 | 0 |
| 0.8430555555555556 | 0 |
| 0.84375 | 0 |
| 0.8444444444444444 | 0 |
| 0.845138888888889 | 0 |
| 0.8458333333333333 | 0 |
| 0.8465277777777778 | 0 |
| 0.8472222222222222 | 0 |
| 0.8479166666666668 | 0 |
| 0.8486111111111111 | 0 |
| 0.8493055555555555 | 0 |
| 0.85 | 0 |
| 0.8506944444444445 | 0 |
| 0.8513888888888889 | 0 |
| 0.8520833333333333 | 0 |
| 0.8527777777777777 | 0 |
| 0.8534722222222223 | 0 |
| 0.8541666666666666 | 0 |
| 0.8548611111111111 | 0 |
| 0.8555555555555556 | 0 |
| 0.8562500000000001 | 0 |
| 0.8569444444444444 | 0 |
| 0.8576388888888888 | 0 |
| 0.8583333333333334 | 0 |
| 0.8590277777777778 | 0 |
| 0.8597222222222222 | 0 |
| 0.8604166666666666 | 0 |
| 0.8611111111111112 | 0 |
| 0.8618055555555556 | 0 |
| 0.8624999999999999 | 0 |
| 0.8631944444444444 | 0 |
| 0.8638888888888889 | 0 |
| 0.8645833333333334 | 0 |
| 0.8652777777777777 | 0 |
| 0.8659722222222223 | 0 |
| 0.8666666666666667 | 0 |
| 0.8673611111111111 | 0 |
| 0.8680555555555555 | 0 |
| 0.86875 | 0 |
| 0.8694444444444445 | 0 |
| 0.8701388888888889 | 0 |
| 0.8708333333333332 | 0 |
| 0.8715277777777778 | 0 |
| 0.8722222222222222 | 0 |
| 0.8729166666666667 | 0 |
| 0.873611111111111 | 0 |
| 0.8743055555555556 | 0 |
| 0.875 | 0 |
| 0.8756944444444444 | 0 |
| 0.876388888888889 | 0 |
| 0.8770833333333333 | 0 |
| 0.8777777777777778 | 0 |
| 0.8784722222222222 | 0 |
| 0.8791666666666668 | 0 |
| 0.8798611111111111 | 0 |
| 0.8805555555555555 | 0 |
| 0.88125 | 0 |
| 0.8819444444444445 | 0 |
| 0.8826388888888889 | 0 |
| 0.8833333333333333 | 0 |
| 0.8840277777777777 | 0 |
| 0.8847222222222223 | 0 |
| 0.8854166666666666 | 0 |
| 0.8861111111111111 | 0 |
| 0.8868055555555556 | 0 |
| 0.8875000000000001 | 0 |
| 0.8881944444444444 | 0 |
| 0.8888888888888888 | 0 |
| 0.8895833333333334 | 0 |
| 0.8902777777777778 | 0 |
| 0.8909722222222222 | 0 |
| 0.8916666666666666 | 0 |
| 0.8923611111111112 | 0 |
| 0.8930555555555556 | 0 |
| 0.8937499999999999 | 0 |
| 0.8944444444444444 | 0 |
| 0.8951388888888889 | 0 |
| 0.8958333333333334 | 0 |
| 0.8965277777777777 | 0 |
| 0.8972222222222223 | 0 |
| 0.8979166666666667 | 0 |
| 0.8986111111111111 | 0 |
| 0.8993055555555555 | 0 |
| 0.9 | 0 |
| 0.9006944444444445 | 0 |
| 0.9013888888888889 | 0 |
| 0.9020833333333332 | 0 |
| 0.9027777777777778 | 0 |
| 0.9034722222222222 | 0 |
| 0.9041666666666667 | 0 |
| 0.904861111111111 | 0 |
| 0.9055555555555556 | 0 |
| 0.90625 | 0 |
| 0.9069444444444444 | 0 |
| 0.907638888888889 | 0 |
| 0.9083333333333333 | 0 |
| 0.9090277777777778 | 0 |
| 0.9097222222222222 | 0 |
| 0.9104166666666668 | 0 |
| 0.9111111111111111 | 0 |
| 0.9118055555555555 | 0 |
| 0.9125 | 0 |
| 0.9131944444444445 | 0 |
| 0.9138888888888889 | 0 |
| 0.9145833333333333 | 0 |
| 0.9152777777777777 | 0 |
| 0.9159722222222223 | 0 |
| 0.9166666666666666 | 0 |
| 0.9173611111111111 | 0 |
| 0.9180555555555556 | 0 |
| 0.9187500000000001 | 0 |
| 0.9194444444444444 | 0 |
| 0.9201388888888888 | 0 |
| 0.9208333333333334 | 0 |
| 0.9215277777777778 | 0 |
| 0.9222222222222222 | 0 |
| 0.9229166666666666 | 0 |
| 0.9236111111111112 | 0 |
| 0.9243055555555556 | 0 |
| 0.9249999999999999 | 0 |
| 0.9256944444444444 | 0 |
| 0.9263888888888889 | 0 |
| 0.9270833333333334 | 0 |
| 0.9277777777777777 | 0 |
| 0.9284722222222223 | 0 |
| 0.9291666666666667 | 0 |
| 0.9298611111111111 | 0 |
| 0.9305555555555555 | 0 |
| 0.93125 | 0 |
| 0.9319444444444445 | 0 |
| 0.9326388888888889 | 0 |
| 0.9333333333333332 | 0 |
| 0.9340277777777778 | 0 |
| 0.9347222222222222 | 0 |
| 0.9354166666666667 | 0 |
| 0.936111111111111 | 0 |
| 0.9368055555555556 | 0 |
| 0.9375 | 0 |
| 0.9381944444444444 | 0 |
| 0.938888888888889 | 0 |
| 0.9395833333333333 | 0 |
| 0.9402777777777778 | 0 |
| 0.9409722222222222 | 0 |
| 0.9416666666666668 | 0 |
| 0.9423611111111111 | 0 |
| 0.9430555555555555 | 0 |
| 0.94375 | 0 |
| 0.9444444444444445 | 0 |
| 0.9451388888888889 | 0 |
| 0.9458333333333333 | 0 |
| 0.9465277777777777 | 0 |
| 0.9472222222222223 | 0 |
| 0.9479166666666666 | 0 |
| 0.9486111111111111 | 0 |
| 0.9493055555555556 | 0 |
| 0.9500000000000001 | 0 |
| 0.9506944444444444 | 0 |
| 0.9513888888888888 | 0 |
| 0.9520833333333334 | 0 |
| 0.9527777777777778 | 0 |
| 0.9534722222222222 | 0 |
| 0.9541666666666666 | 0 |
| 0.9548611111111112 | 0 |
| 0.9555555555555556 | 0 |
| 0.9562499999999999 | 0 |
| 0.9569444444444444 | 0 |
| 0.9576388888888889 | 0 |
| 0.9583333333333334 | 0 |
| 0.9590277777777777 | 0 |
| 0.9597222222222223 | 0 |
| 0.9604166666666667 | 0 |
| 0.9611111111111111 | 0 |
| 0.9618055555555555 | 0 |
| 0.9625 | 0 |
| 0.9631944444444445 | 0 |
| 0.9638888888888889 | 0 |
| 0.9645833333333332 | 0 |
| 0.9652777777777778 | 0 |
| 0.9659722222222222 | 0 |
| 0.9666666666666667 | 0 |
| 0.967361111111111 | 0 |
| 0.9680555555555556 | 0 |
| 0.96875 | 0 |
| 0.9694444444444444 | 0 |
| 0.970138888888889 | 0 |
| 0.9708333333333333 | 0 |
| 0.9715277777777778 | 0 |
| 0.9722222222222222 | 0 |
| 0.9729166666666668 | 0 |
| 0.9736111111111111 | 0 |
| 0.9743055555555555 | 0 |
| 0.975 | 0 |
| 0.9756944444444445 | 0 |
| 0.9763888888888889 | 0 |
| 0.9770833333333333 | 0 |
| 0.9777777777777777 | 0 |
| 0.9784722222222223 | 0 |
| 0.9791666666666666 | 0 |
| 0.9798611111111111 | 0 |
| 0.9805555555555556 | 0 |
| 0.9812500000000001 | 0 |
| 0.9819444444444444 | 0 |
| 0.9826388888888888 | 0 |
| 0.9833333333333334 | 0 |
| 0.9840277777777778 | 0 |
| 0.9847222222222222 | 0 |
| 0.9854166666666666 | 0 |
| 0.9861111111111112 | 0 |
| 0.9868055555555556 | 0 |
| 0.9874999999999999 | 0 |
| 0.9881944444444444 | 0 |
| 0.9888888888888889 | 0 |
| 0.9895833333333334 | 0 |
| 0.9902777777777777 | 0 |
| 0.9909722222222223 | 0 |
| 0.9916666666666667 | 0 |
| 0.9923611111111111 | 0 |
| 0.9930555555555555 | 0 |
| 0.99375 | 0 |
| 0.9944444444444445 | 0 |
| 0.9951388888888889 | 0 |
| 0.9958333333333332 | 0 |
| 0.9965277777777778 | 0 |
| 0.9972222222222222 | 0 |
| 0.9979166666666667 | 0 |
| 0.998611111111111 | 0 |
| 0.9993055555555556 | 0 |